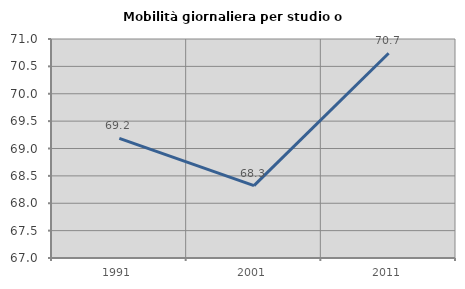
| Category | Mobilità giornaliera per studio o lavoro |
|---|---|
| 1991.0 | 69.184 |
| 2001.0 | 68.323 |
| 2011.0 | 70.74 |